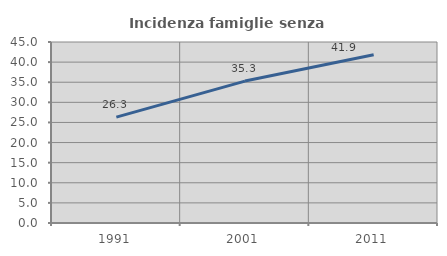
| Category | Incidenza famiglie senza nuclei |
|---|---|
| 1991.0 | 26.329 |
| 2001.0 | 35.282 |
| 2011.0 | 41.852 |